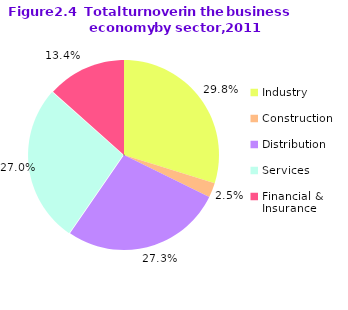
| Category | Series 0 |
|---|---|
| Industry | 0.298 |
| Construction | 0.025 |
| Distribution | 0.273 |
| Services | 0.27 |
| Financial & Insurance | 0.134 |